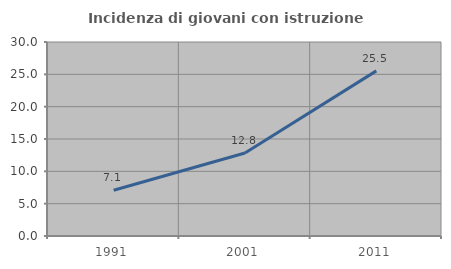
| Category | Incidenza di giovani con istruzione universitaria |
|---|---|
| 1991.0 | 7.08 |
| 2001.0 | 12.844 |
| 2011.0 | 25.532 |